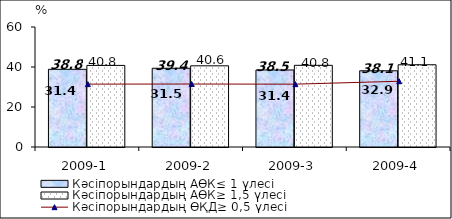
| Category | Кәсіпорындардың АӨК≤ 1 үлесі | Кәсіпорындардың АӨК≥ 1,5 үлесі |
|---|---|---|
| 2009-1 | 38.84 | 40.79 |
| 2009-2 | 39.37 | 40.59 |
| 2009-3 | 38.52 | 40.84 |
| 2009-4 | 38.11 | 41.12 |